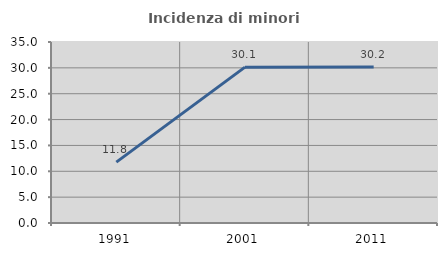
| Category | Incidenza di minori stranieri |
|---|---|
| 1991.0 | 11.765 |
| 2001.0 | 30.137 |
| 2011.0 | 30.175 |